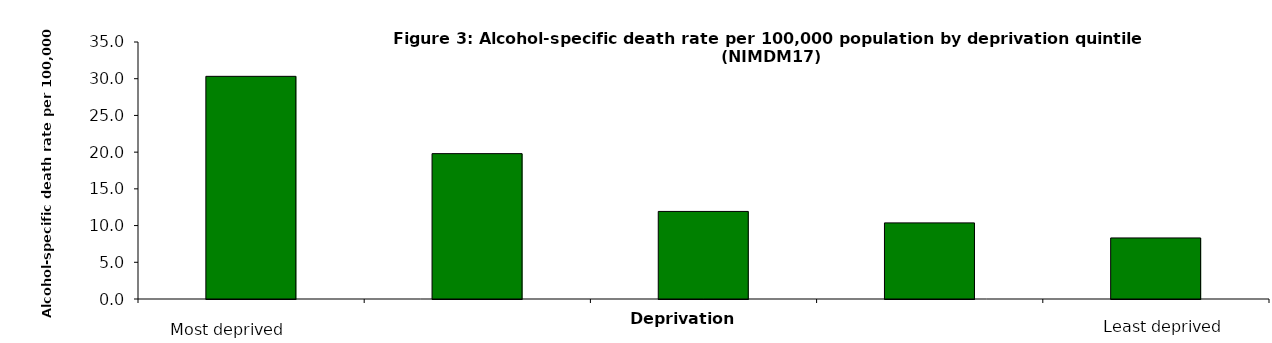
| Category | Alcohol Related Deaths |
|---|---|
| 0 | 30.325 |
| 1 | 19.796 |
| 2 | 11.925 |
| 3 | 10.367 |
| 4 | 8.314 |